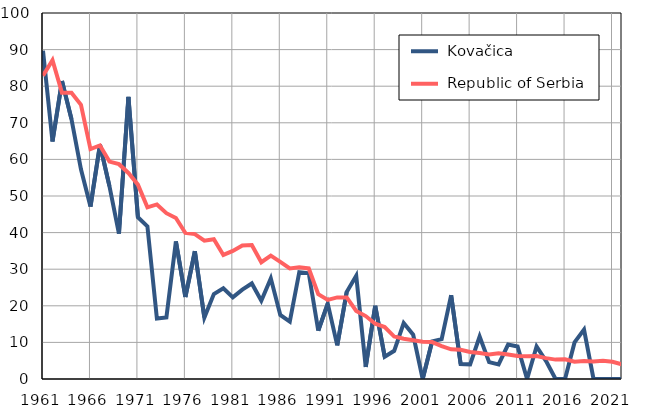
| Category |  Kovačica |  Republic of Serbia |
|---|---|---|
| 1961.0 | 89.7 | 82.9 |
| 1962.0 | 64.9 | 87.1 |
| 1963.0 | 81.4 | 78.2 |
| 1964.0 | 71 | 78.2 |
| 1965.0 | 57.3 | 74.9 |
| 1966.0 | 47.1 | 62.8 |
| 1967.0 | 64 | 63.8 |
| 1968.0 | 52.7 | 59.4 |
| 1969.0 | 39.7 | 58.7 |
| 1970.0 | 77.1 | 56.3 |
| 1971.0 | 44.2 | 53.1 |
| 1972.0 | 41.7 | 46.9 |
| 1973.0 | 16.5 | 47.7 |
| 1974.0 | 16.8 | 45.3 |
| 1975.0 | 37.6 | 44 |
| 1976.0 | 22.4 | 39.9 |
| 1977.0 | 34.9 | 39.6 |
| 1978.0 | 16.8 | 37.8 |
| 1979.0 | 23.2 | 38.2 |
| 1980.0 | 24.8 | 33.9 |
| 1981.0 | 22.3 | 35 |
| 1982.0 | 24.4 | 36.5 |
| 1983.0 | 26.1 | 36.6 |
| 1984.0 | 21.4 | 31.9 |
| 1985.0 | 27.5 | 33.7 |
| 1986.0 | 17.5 | 32 |
| 1987.0 | 15.7 | 30.2 |
| 1988.0 | 29.2 | 30.5 |
| 1989.0 | 28.9 | 30.2 |
| 1990.0 | 13.2 | 23.2 |
| 1991.0 | 20.6 | 21.6 |
| 1992.0 | 9.2 | 22.3 |
| 1993.0 | 23.8 | 22.3 |
| 1994.0 | 28.2 | 18.6 |
| 1995.0 | 3.3 | 17.2 |
| 1996.0 | 20 | 15.1 |
| 1997.0 | 6.1 | 14.2 |
| 1998.0 | 7.7 | 11.6 |
| 1999.0 | 15.3 | 11 |
| 2000.0 | 12.1 | 10.6 |
| 2001.0 | 0 | 10.2 |
| 2002.0 | 10.3 | 10.1 |
| 2003.0 | 10.9 | 9 |
| 2004.0 | 22.9 | 8.1 |
| 2005.0 | 4.1 | 8 |
| 2006.0 | 4 | 7.4 |
| 2007.0 | 11.6 | 7.1 |
| 2008.0 | 4.6 | 6.7 |
| 2009.0 | 4 | 7 |
| 2010.0 | 9.4 | 6.7 |
| 2011.0 | 8.9 | 6.3 |
| 2012.0 | 0 | 6.2 |
| 2013.0 | 8.9 | 6.3 |
| 2014.0 | 4.9 | 5.7 |
| 2015.0 | 0 | 5.3 |
| 2016.0 | 0 | 5.4 |
| 2017.0 | 10 | 4.7 |
| 2018.0 | 13.5 | 4.9 |
| 2019.0 | 0 | 4.8 |
| 2020.0 | 0 | 5 |
| 2021.0 | 0 | 4.7 |
| 2022.0 | 0 | 4 |